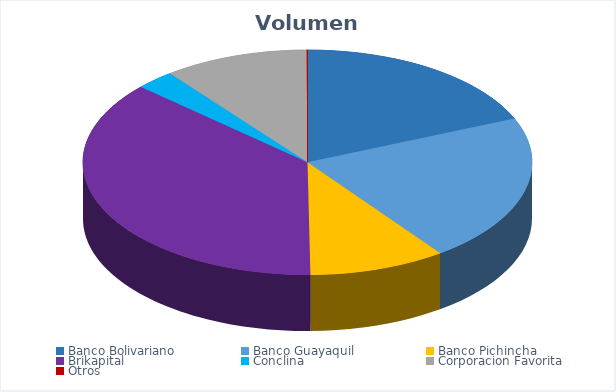
| Category | VOLUMEN ($USD) |
|---|---|
| Banco Bolivariano | 18170.08 |
| Banco Guayaquil | 20804.01 |
| Banco Pichincha | 9600 |
| Brikapital | 36000 |
| Conclina | 2736 |
| Corporacion Favorita | 10169.34 |
| Otros | 66 |